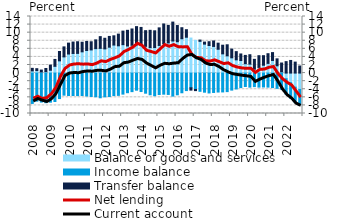
| Category | Balance of goods and services | Income balance | Transfer balance |
|---|---|---|---|
| 2008.0 | 0.541 | -7.513 | 0.629 |
| 2008.0 | 0.609 | -6.945 | 0.477 |
| 2008.0 | 0.273 | -7.172 | 0.473 |
| 2008.0 | 0.346 | -7.33 | 0.793 |
| 2009.0 | 0.706 | -7.199 | 1.252 |
| 2009.0 | 1.676 | -7.027 | 1.702 |
| 2009.0 | 3.028 | -6.31 | 2.319 |
| 2009.0 | 4.008 | -5.461 | 2.475 |
| 2010.0 | 4.718 | -5.542 | 2.696 |
| 2010.0 | 4.856 | -5.548 | 2.822 |
| 2010.0 | 4.875 | -5.569 | 2.881 |
| 2010.0 | 5.259 | -5.545 | 2.37 |
| 2011.0 | 5.584 | -5.666 | 2.229 |
| 2011.0 | 5.738 | -5.787 | 2.01 |
| 2011.0 | 6.051 | -5.869 | 2.165 |
| 2011.0 | 6.114 | -6.109 | 2.905 |
| 2012.0 | 5.99 | -5.885 | 2.621 |
| 2012.0 | 6.405 | -5.809 | 2.664 |
| 2012.0 | 6.932 | -5.562 | 2.291 |
| 2012.0 | 6.749 | -5.515 | 2.895 |
| 2013.0 | 7.032 | -5.201 | 3.352 |
| 2013.0 | 6.701 | -4.855 | 3.878 |
| 2013.0 | 6.881 | -4.589 | 4.034 |
| 2013.0 | 6.971 | -4.23 | 4.522 |
| 2014.0 | 7.036 | -4.566 | 4.26 |
| 2014.0 | 6.623 | -4.977 | 3.871 |
| 2014.0 | 6.307 | -5.364 | 4.275 |
| 2014.0 | 6.316 | -5.599 | 4.145 |
| 2015.0 | 6.838 | -5.309 | 4.35 |
| 2015.0 | 7.308 | -5.216 | 4.842 |
| 2015.0 | 7.477 | -5.283 | 4.32 |
| 2015.0 | 7.943 | -5.693 | 4.673 |
| 2016.0 | 7.764 | -5.377 | 4.002 |
| 2016.0 | 8.503 | -4.87 | 2.723 |
| 2016.0 | 8.868 | -4.329 | 1.866 |
| 2016.0 | 8.672 | -3.641 | -0.569 |
| 2017.0 | 8.089 | -4.054 | -0.284 |
| 2017.0 | 7.862 | -4.508 | 0.303 |
| 2017.0 | 7.163 | -4.725 | 0.502 |
| 2017.0 | 6.82 | -4.916 | 0.941 |
| 2018.0 | 6.595 | -4.794 | 1.358 |
| 2018.0 | 5.894 | -4.689 | 1.507 |
| 2018.0 | 4.759 | -4.663 | 2.139 |
| 2018.0 | 4.267 | -4.589 | 2.734 |
| 2019.0 | 3.779 | -4.209 | 2.157 |
| 2019.0 | 3.275 | -3.931 | 2.033 |
| 2019.0 | 3.104 | -3.58 | 1.627 |
| 2019.0 | 2.325 | -3.324 | 2.048 |
| 2020.0 | 2.215 | -3.479 | 2.325 |
| 2020.0 | 0.977 | -3.354 | 2.42 |
| 2020.0 | 1.408 | -3.475 | 2.895 |
| 2020.0 | 1.939 | -3.439 | 2.367 |
| 2021.0 | 2.403 | -3.475 | 2.393 |
| 2021.0 | 3.122 | -3.57 | 1.946 |
| 2021.0 | 1.801 | -3.775 | 1.72 |
| 2021.0 | 0.317 | -4.018 | 2.174 |
| 2022.0 | -1.405 | -3.839 | 2.832 |
| 2022.0 | -2.388 | -3.805 | 3.124 |
| 2022.0 | -3.48 | -3.823 | 2.714 |
| 2022.0 | -4.046 | -3.783 | 1.748 |